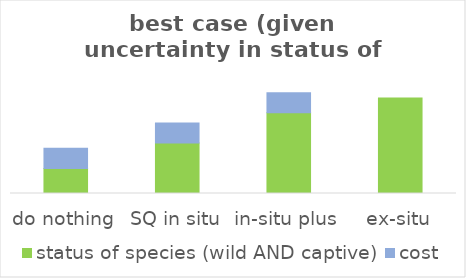
| Category | status of species (wild AND captive) | cost |
|---|---|---|
| do nothing | 0.207 | 0.167 |
| SQ in situ | 0.417 | 0.167 |
| in-situ plus | 0.667 | 0.167 |
| ex-situ | 0.79 | 0 |